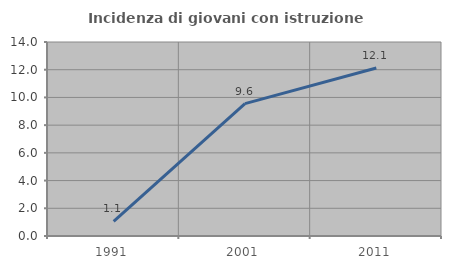
| Category | Incidenza di giovani con istruzione universitaria |
|---|---|
| 1991.0 | 1.059 |
| 2001.0 | 9.555 |
| 2011.0 | 12.127 |